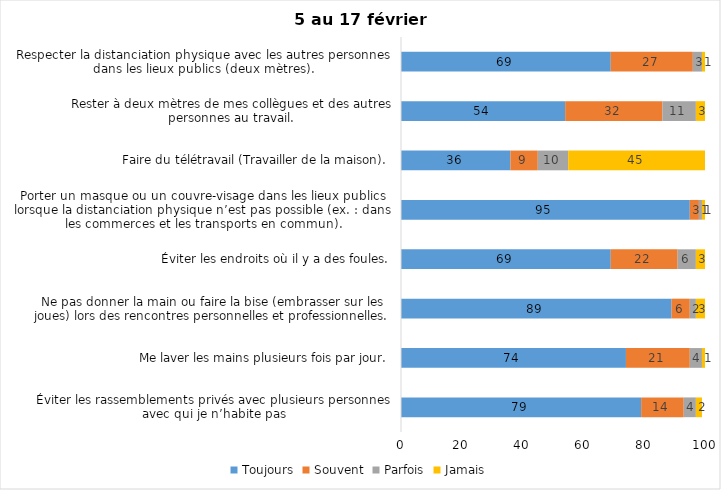
| Category | Toujours | Souvent | Parfois | Jamais |
|---|---|---|---|---|
| Éviter les rassemblements privés avec plusieurs personnes avec qui je n’habite pas | 79 | 14 | 4 | 2 |
| Me laver les mains plusieurs fois par jour. | 74 | 21 | 4 | 1 |
| Ne pas donner la main ou faire la bise (embrasser sur les joues) lors des rencontres personnelles et professionnelles. | 89 | 6 | 2 | 3 |
| Éviter les endroits où il y a des foules. | 69 | 22 | 6 | 3 |
| Porter un masque ou un couvre-visage dans les lieux publics lorsque la distanciation physique n’est pas possible (ex. : dans les commerces et les transports en commun). | 95 | 3 | 1 | 1 |
| Faire du télétravail (Travailler de la maison). | 36 | 9 | 10 | 45 |
| Rester à deux mètres de mes collègues et des autres personnes au travail. | 54 | 32 | 11 | 3 |
| Respecter la distanciation physique avec les autres personnes dans les lieux publics (deux mètres). | 69 | 27 | 3 | 1 |